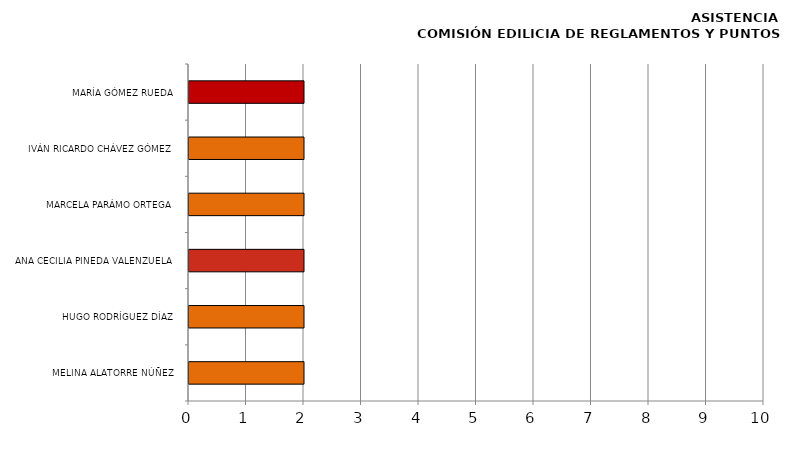
| Category | Series 0 |
|---|---|
| MELINA ALATORRE NÚÑEZ | 2 |
| HUGO RODRÍGUEZ DÍAZ | 2 |
| ANA CECILIA PINEDA VALENZUELA | 2 |
| MARCELA PARÁMO ORTEGA | 2 |
| IVÁN RICARDO CHÁVEZ GÓMEZ | 2 |
| MARÍA GÓMEZ RUEDA | 2 |